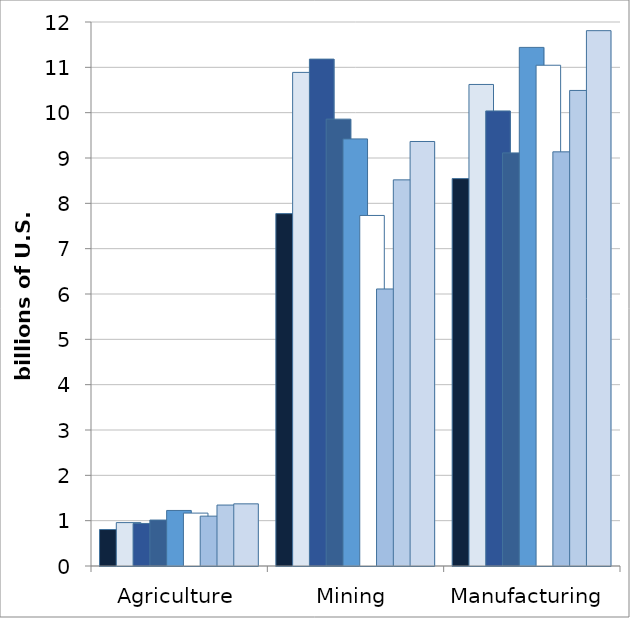
| Category | 2010 | 2011 | 2012 | 2013 | 2014 | 2015 | 2016 | 2017 | 2018 |
|---|---|---|---|---|---|---|---|---|---|
| Agriculture | 0.805 | 0.957 | 0.939 | 1.014 | 1.225 | 1.167 | 1.1 | 1.344 | 1.371 |
| Mining | 7.773 | 10.888 | 11.181 | 9.857 | 9.421 | 7.732 | 6.111 | 8.518 | 9.364 |
| Manufacturing | 8.545 | 10.622 | 10.038 | 9.112 | 11.44 | 11.046 | 9.136 | 10.49 | 11.809 |